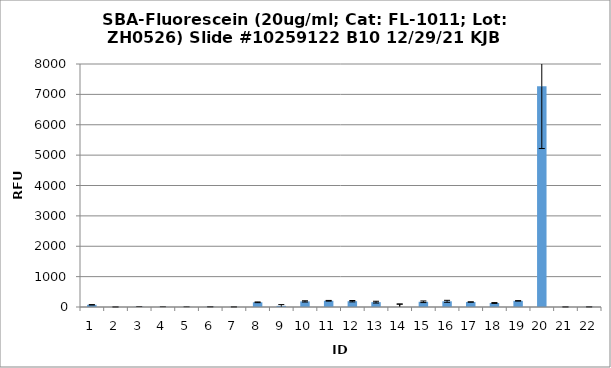
| Category | Series 0 |
|---|---|
| 0 | 72.25 |
| 1 | 2 |
| 2 | 7 |
| 3 | 4.75 |
| 4 | 3 |
| 5 | 7.25 |
| 6 | 3.5 |
| 7 | 154.75 |
| 8 | 38 |
| 9 | 184 |
| 10 | 205 |
| 11 | 191 |
| 12 | 159.75 |
| 13 | -8.5 |
| 14 | 172 |
| 15 | 187.25 |
| 16 | 164 |
| 17 | 131.5 |
| 18 | 202 |
| 19 | 7268.5 |
| 20 | 3.25 |
| 21 | 4.5 |